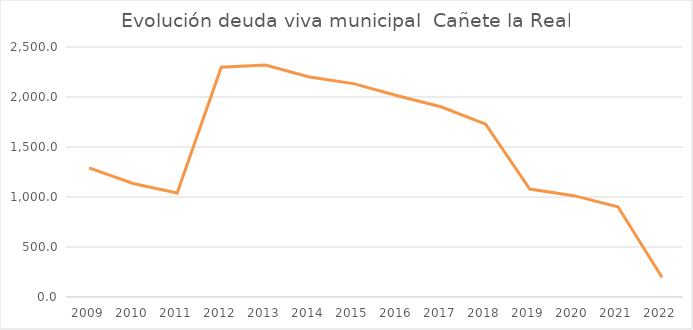
| Category | Series 0 |
|---|---|
| 2009.0 | 1292 |
| 2010.0 | 1135 |
| 2011.0 | 1040 |
| 2012.0 | 2296.84 |
| 2013.0 | 2319.244 |
| 2014.0 | 2200.244 |
| 2015.0 | 2134 |
| 2016.0 | 2012.142 |
| 2017.0 | 1900.147 |
| 2018.0 | 1728.495 |
| 2019.0 | 1079.202 |
| 2020.0 | 1013.309 |
| 2021.0 | 901.826 |
| 2022.0 | 197.678 |